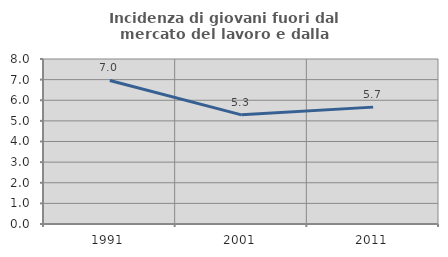
| Category | Incidenza di giovani fuori dal mercato del lavoro e dalla formazione  |
|---|---|
| 1991.0 | 6.958 |
| 2001.0 | 5.293 |
| 2011.0 | 5.667 |